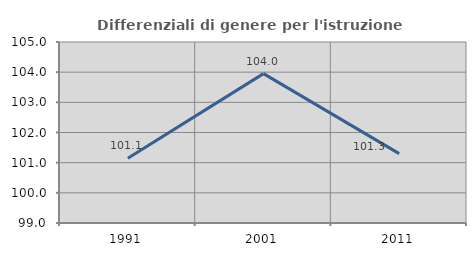
| Category | Differenziali di genere per l'istruzione superiore |
|---|---|
| 1991.0 | 101.148 |
| 2001.0 | 103.952 |
| 2011.0 | 101.298 |